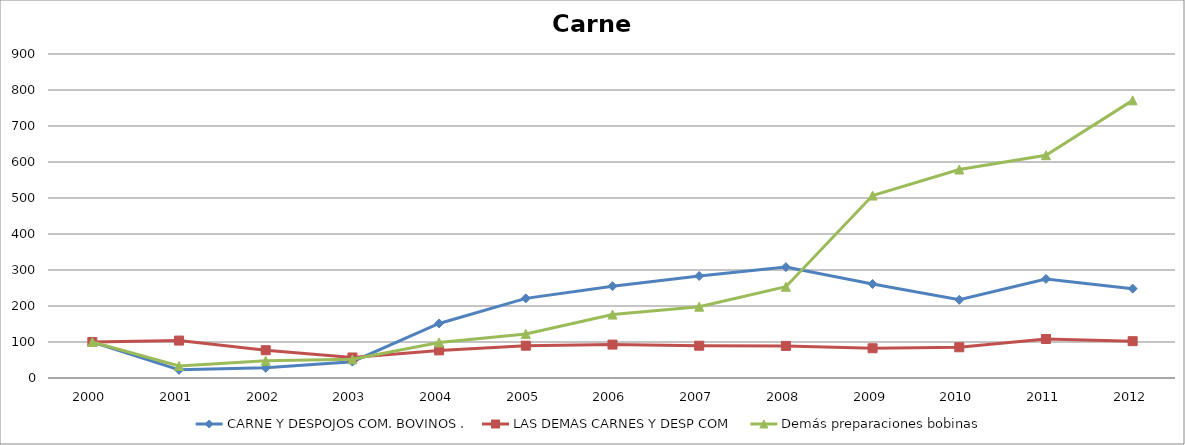
| Category | CARNE Y DESPOJOS COM. BOVINOS . | LAS DEMAS CARNES Y DESP COM  | Demás preparaciones bobinas |
|---|---|---|---|
| 2000 | 100 | 100 | 100 |
| 2001 | 22.621 | 103.992 | 33.453 |
| 2002 | 28.159 | 77.194 | 47.978 |
| 2003 | 45.411 | 56.967 | 51.912 |
| 2004 | 151.543 | 76.655 | 98.657 |
| 2005 | 221.146 | 89.754 | 122.45 |
| 2006 | 254.926 | 92.838 | 176.177 |
| 2007 | 283.475 | 89.642 | 198.132 |
| 2008 | 307.977 | 89.08 | 253.517 |
| 2009 | 261.162 | 82.639 | 506.833 |
| 2010 | 217.221 | 85.335 | 579.105 |
| 2011 | 275.212 | 108.413 | 618.886 |
| 2012 | 248.234 | 102.26 | 771.195 |